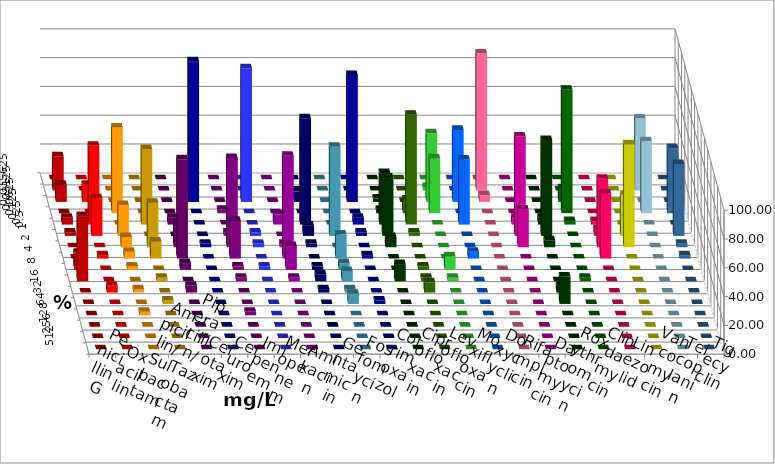
| Category | Penicillin G | Oxacillin | Ampicillin/ Sulbactam | Piperacillin/ Tazobactam | Cefotaxim | Cefuroxim | Imipenem | Meropenem | Amikacin | Gentamicin | Fosfomycin | Cotrimoxazol | Ciprofloxacin | Levofloxacin | Moxifloxacin | Doxycyclin | Rifampicin | Daptomycin | Roxythromycin | Clindamycin | Linezolid | Vancomycin | Teicoplanin | Tigecyclin |
|---|---|---|---|---|---|---|---|---|---|---|---|---|---|---|---|---|---|---|---|---|---|---|---|---|
| 0.015625 | 0 | 0 | 0 | 0 | 0 | 0 | 0 | 0 | 0 | 0 | 0 | 0 | 0 | 0 | 0 | 0 | 0 | 0 | 0 | 0 | 0 | 0 | 0 | 0 |
| 0.03125 | 23.81 | 0 | 0 | 0 | 0 | 0 | 0 | 0 | 0 | 0 | 0 | 0 | 0 | 0 | 2.381 | 0 | 95.238 | 0 | 0 | 0 | 0 | 0 | 0 | 50 |
| 0.0625 | 11.905 | 11.905 | 0 | 0 | 0 | 0 | 97.619 | 92.857 | 0 | 7.143 | 0 | 88.095 | 2.381 | 0 | 47.619 | 50 | 4.762 | 0 | 0 | 9.524 | 0 | 0 | 0 | 0 |
| 0.125 | 0 | 0 | 59.524 | 0 | 0 | 2.381 | 0 | 0 | 0 | 0 | 0 | 0 | 2.381 | 9.524 | 38.095 | 0 | 0 | 0 | 0 | 85.714 | 0 | 0 | 45.238 | 50 |
| 0.25 | 4.762 | 54.762 | 0 | 52.381 | 4.762 | 0 | 0 | 0 | 7.143 | 73.81 | 0 | 4.762 | 35.714 | 76.19 | 0 | 45.238 | 0 | 4.762 | 4.762 | 2.381 | 2.381 | 0 | 0 | 0 |
| 0.5 | 2.381 | 26.19 | 21.429 | 0 | 0 | 2.381 | 0 | 2.381 | 0 | 7.143 | 61.905 | 2.381 | 40.476 | 2.381 | 0 | 0 | 0 | 69.048 | 66.667 | 0 | 4.762 | 28.571 | 50 | 0 |
| 1.0 | 0 | 0 | 7.143 | 30.952 | 16.667 | 61.905 | 2.381 | 2.381 | 2.381 | 2.381 | 0 | 0 | 7.143 | 0 | 0 | 0 | 0 | 26.19 | 4.762 | 0 | 47.619 | 71.429 | 2.381 | 0 |
| 2.0 | 0 | 2.381 | 4.762 | 11.905 | 69.048 | 26.19 | 0 | 0 | 71.429 | 0 | 16.667 | 2.381 | 0 | 0 | 0 | 4.762 | 0 | 0 | 0 | 0 | 45.238 | 0 | 2.381 | 0 |
| 4.0 | 11.905 | 0 | 2.381 | 0 | 4.762 | 2.381 | 0 | 2.381 | 16.667 | 2.381 | 4.762 | 0 | 0 | 2.381 | 9.524 | 0 | 0 | 0 | 0 | 0 | 0 | 0 | 0 | 0 |
| 8.0 | 45.238 | 0 | 0 | 2.381 | 0 | 2.381 | 0 | 0 | 2.381 | 4.762 | 7.143 | 0 | 11.905 | 2.381 | 2.381 | 0 | 0 | 0 | 0 | 2.381 | 0 | 0 | 0 | 0 |
| 16.0 | 0 | 4.762 | 2.381 | 0 | 4.762 | 0 | 0 | 0 | 0 | 2.381 | 2.381 | 0 | 0 | 7.143 | 0 | 0 | 0 | 0 | 4.762 | 0 | 0 | 0 | 0 | 0 |
| 32.0 | 0 | 0 | 0 | 2.381 | 0 | 0 | 0 | 0 | 0 | 0 | 7.143 | 2.381 | 0 | 0 | 0 | 0 | 0 | 0 | 19.048 | 0 | 0 | 0 | 0 | 0 |
| 64.0 | 0 | 0 | 2.381 | 0 | 0 | 2.381 | 0 | 0 | 0 | 0 | 0 | 0 | 0 | 0 | 0 | 0 | 0 | 0 | 0 | 0 | 0 | 0 | 0 | 0 |
| 128.0 | 0 | 0 | 0 | 0 | 0 | 0 | 0 | 0 | 0 | 0 | 0 | 0 | 0 | 0 | 0 | 0 | 0 | 0 | 0 | 0 | 0 | 0 | 0 | 0 |
| 256.0 | 0 | 0 | 0 | 0 | 0 | 0 | 0 | 0 | 0 | 0 | 0 | 0 | 0 | 0 | 0 | 0 | 0 | 0 | 0 | 0 | 0 | 0 | 0 | 0 |
| 512.0 | 0 | 0 | 0 | 0 | 0 | 0 | 0 | 0 | 0 | 0 | 0 | 0 | 0 | 0 | 0 | 0 | 0 | 0 | 0 | 0 | 0 | 0 | 0 | 0 |